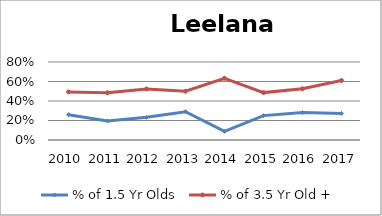
| Category | % of 1.5 Yr Olds | % of 3.5 Yr Old + |
|---|---|---|
| 2010.0 | 0.26 | 0.494 |
| 2011.0 | 0.196 | 0.485 |
| 2012.0 | 0.233 | 0.523 |
| 2013.0 | 0.29 | 0.5 |
| 2014.0 | 0.089 | 0.633 |
| 2015.0 | 0.25 | 0.486 |
| 2016.0 | 0.282 | 0.526 |
| 2017.0 | 0.273 | 0.61 |